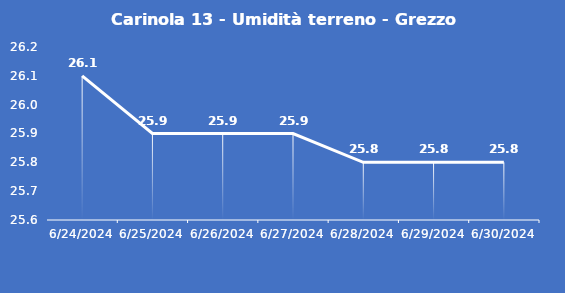
| Category | Carinola 13 - Umidità terreno - Grezzo (%VWC) |
|---|---|
| 6/24/24 | 26.1 |
| 6/25/24 | 25.9 |
| 6/26/24 | 25.9 |
| 6/27/24 | 25.9 |
| 6/28/24 | 25.8 |
| 6/29/24 | 25.8 |
| 6/30/24 | 25.8 |